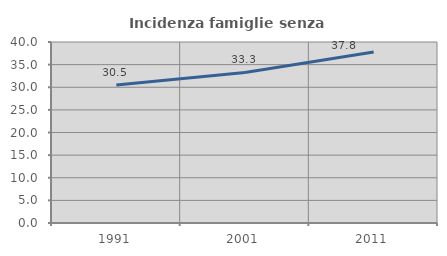
| Category | Incidenza famiglie senza nuclei |
|---|---|
| 1991.0 | 30.508 |
| 2001.0 | 33.263 |
| 2011.0 | 37.77 |